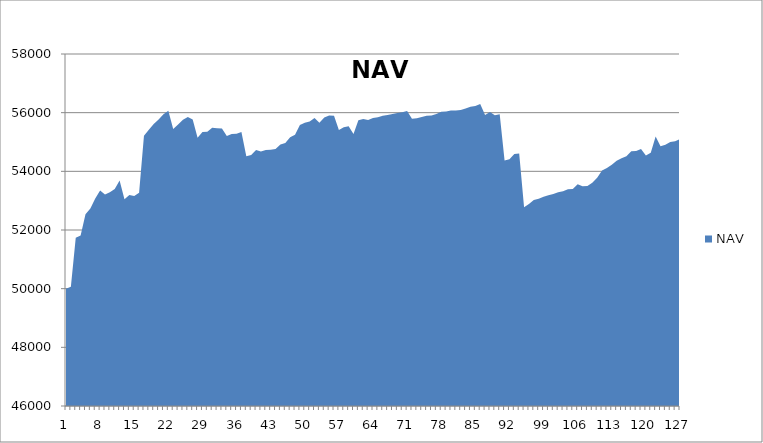
| Category | NAV |
|---|---|
| 0 | 50000 |
| 1 | 50069.444 |
| 2 | 51736.444 |
| 3 | 51809.343 |
| 4 | 52539.343 |
| 5 | 52733.57 |
| 6 | 53070.527 |
| 7 | 53346.212 |
| 8 | 53210.13 |
| 9 | 53285.788 |
| 10 | 53396.685 |
| 11 | 53684.185 |
| 12 | 53050.597 |
| 13 | 53191.058 |
| 14 | 53162.649 |
| 15 | 53270.317 |
| 16 | 55214.762 |
| 17 | 55418.583 |
| 18 | 55617.273 |
| 19 | 55770.477 |
| 20 | 55945.477 |
| 21 | 56069.601 |
| 22 | 55444.601 |
| 23 | 55597.925 |
| 24 | 55757.558 |
| 25 | 55851.308 |
| 26 | 55764.06 |
| 27 | 55148.361 |
| 28 | 55340.028 |
| 29 | 55349.317 |
| 30 | 55485.393 |
| 31 | 55468.704 |
| 32 | 55461.038 |
| 33 | 55205.356 |
| 34 | 55270.356 |
| 35 | 55282.57 |
| 36 | 55341.011 |
| 37 | 54517.482 |
| 38 | 54554.291 |
| 39 | 54731.016 |
| 40 | 54679.093 |
| 41 | 54730.595 |
| 42 | 54736.73 |
| 43 | 54765.085 |
| 44 | 54915.643 |
| 45 | 54969.86 |
| 46 | 55164.665 |
| 47 | 55247.746 |
| 48 | 55575.668 |
| 49 | 55657.905 |
| 50 | 55701.032 |
| 51 | 55819.28 |
| 52 | 55652.834 |
| 53 | 55838.604 |
| 54 | 55905.769 |
| 55 | 55898.888 |
| 56 | 55410.9 |
| 57 | 55504.564 |
| 58 | 55537.603 |
| 59 | 55268.471 |
| 60 | 55737.858 |
| 61 | 55785.708 |
| 62 | 55749.829 |
| 63 | 55815.591 |
| 64 | 55842.34 |
| 65 | 55894.021 |
| 66 | 55916.828 |
| 67 | 55955.697 |
| 68 | 55991.896 |
| 69 | 56012.065 |
| 70 | 56060.293 |
| 71 | 55791.443 |
| 72 | 55810.674 |
| 73 | 55852.843 |
| 74 | 55892.018 |
| 75 | 55900.069 |
| 76 | 55955.739 |
| 77 | 56030.918 |
| 78 | 56036.168 |
| 79 | 56069.975 |
| 80 | 56071.656 |
| 81 | 56090.406 |
| 82 | 56141.798 |
| 83 | 56199.159 |
| 84 | 56228.237 |
| 85 | 56292.573 |
| 86 | 55924.369 |
| 87 | 56019.106 |
| 88 | 55916.165 |
| 89 | 55950.09 |
| 90 | 54367.13 |
| 91 | 54411.811 |
| 92 | 54588.933 |
| 93 | 54611.197 |
| 94 | 52777.117 |
| 95 | 52883.107 |
| 96 | 53025.651 |
| 97 | 53064.908 |
| 98 | 53135.652 |
| 99 | 53186.005 |
| 100 | 53229.789 |
| 101 | 53290.192 |
| 102 | 53319.038 |
| 103 | 53392.112 |
| 104 | 53401.462 |
| 105 | 53559.878 |
| 106 | 53489.526 |
| 107 | 53501.684 |
| 108 | 53607.597 |
| 109 | 53785.178 |
| 110 | 54030.211 |
| 111 | 54113.452 |
| 112 | 54226.272 |
| 113 | 54358.625 |
| 114 | 54444.736 |
| 115 | 54518.421 |
| 116 | 54681.882 |
| 117 | 54693.454 |
| 118 | 54759.719 |
| 119 | 54542.637 |
| 120 | 54631.804 |
| 121 | 55189.582 |
| 122 | 54857.283 |
| 123 | 54902.45 |
| 124 | 54998.878 |
| 125 | 55024.352 |
| 126 | 55097.595 |